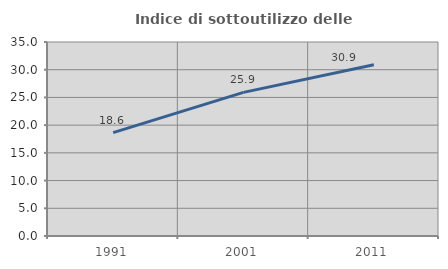
| Category | Indice di sottoutilizzo delle abitazioni  |
|---|---|
| 1991.0 | 18.646 |
| 2001.0 | 25.917 |
| 2011.0 | 30.896 |